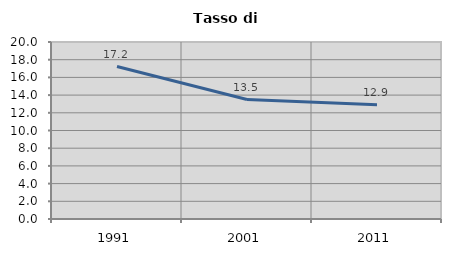
| Category | Tasso di disoccupazione   |
|---|---|
| 1991.0 | 17.226 |
| 2001.0 | 13.501 |
| 2011.0 | 12.907 |